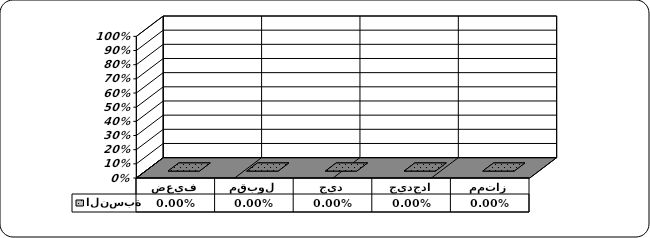
| Category | النسبة |
|---|---|
| ممتاز | 0 |
| جيدجدا | 0 |
| جيد | 0 |
| مقبول | 0 |
| ضعيف | 0 |